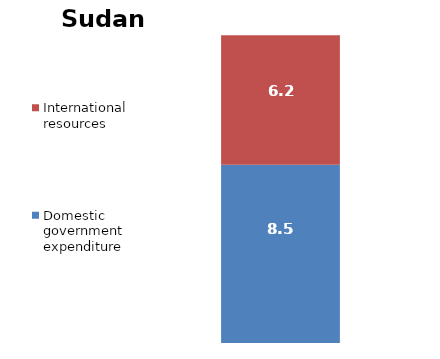
| Category | Domestic government expenditure | International resources |
|---|---|---|
| 0 | 8.544 | 6.204 |